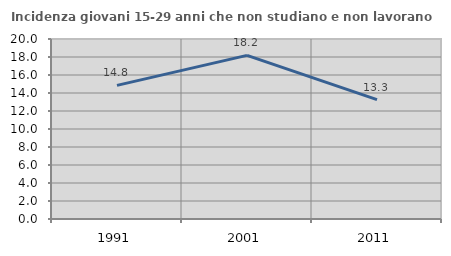
| Category | Incidenza giovani 15-29 anni che non studiano e non lavorano  |
|---|---|
| 1991.0 | 14.848 |
| 2001.0 | 18.182 |
| 2011.0 | 13.265 |